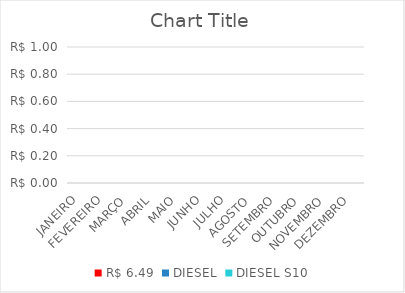
| Category | R$ 6,49 | DIESEL | DIESEL S10 |
|---|---|---|---|
| JANEIRO | 0 | 0 | 0 |
| FEVEREIRO | 0 | 0 | 0 |
| MARÇO | 0 | 0 | 0 |
| ABRIL | 0 | 0 | 0 |
| MAIO | 0 | 0 | 0 |
| JUNHO | 0 | 0 | 0 |
| JULHO | 0 | 0 | 0 |
| AGOSTO | 0 | 0 | 0 |
| SETEMBRO | 0 | 0 | 0 |
| OUTUBRO | 0 | 0 | 0 |
| NOVEMBRO | 0 | 0 | 0 |
| DEZEMBRO | 0 | 0 | 0 |